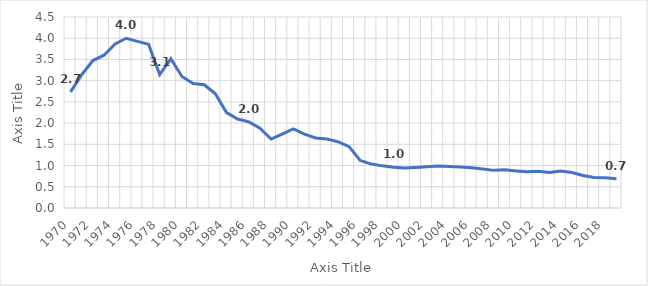
| Category | At/inat. |
|---|---|
| 1970.0 | 2.736 |
| 1971.0 | 3.14 |
| 1972.0 | 3.474 |
| 1973.0 | 3.6 |
| 1974.0 | 3.864 |
| 1975.0 | 3.999 |
| 1976.0 | 3.926 |
| 1977.0 | 3.856 |
| 1978.0 | 3.144 |
| 1979.0 | 3.516 |
| 1980.0 | 3.1 |
| 1981.0 | 2.933 |
| 1982.0 | 2.903 |
| 1983.0 | 2.689 |
| 1984.0 | 2.249 |
| 1985.0 | 2.097 |
| 1986.0 | 2.029 |
| 1987.0 | 1.879 |
| 1988.0 | 1.624 |
| 1989.0 | 1.742 |
| 1990.0 | 1.862 |
| 1991.0 | 1.74 |
| 1992.0 | 1.651 |
| 1993.0 | 1.624 |
| 1994.0 | 1.563 |
| 1995.0 | 1.446 |
| 1996.0 | 1.122 |
| 1997.0 | 1.034 |
| 1998.0 | 0.993 |
| 1999.0 | 0.96 |
| 2000.0 | 0.943 |
| 2001.0 | 0.956 |
| 2002.0 | 0.974 |
| 2003.0 | 0.992 |
| 2004.0 | 0.979 |
| 2005.0 | 0.966 |
| 2006.0 | 0.948 |
| 2007.0 | 0.916 |
| 2008.0 | 0.887 |
| 2009.0 | 0.899 |
| 2010.0 | 0.874 |
| 2011.0 | 0.853 |
| 2012.0 | 0.867 |
| 2013.0 | 0.837 |
| 2014.0 | 0.87 |
| 2015.0 | 0.835 |
| 2016.0 | 0.768 |
| 2017.0 | 0.72 |
| 2018.0 | 0.715 |
| 2019.0 | 0.691 |